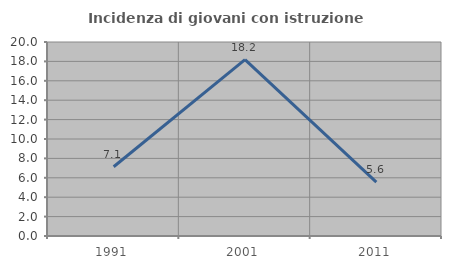
| Category | Incidenza di giovani con istruzione universitaria |
|---|---|
| 1991.0 | 7.143 |
| 2001.0 | 18.182 |
| 2011.0 | 5.556 |